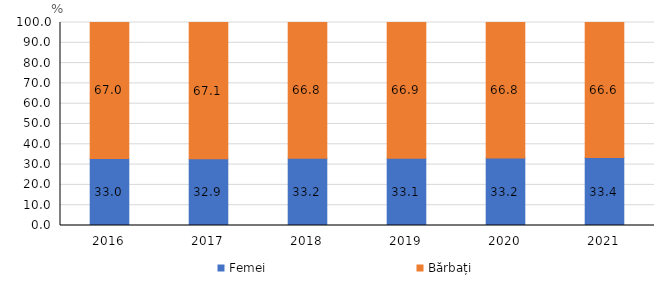
| Category | Femei | Bărbați |
|---|---|---|
| 2016.0 | 33.006 | 66.994 |
| 2017.0 | 32.888 | 67.112 |
| 2018.0 | 33.168 | 66.832 |
| 2019.0 | 33.082 | 66.918 |
| 2020.0 | 33.191 | 66.809 |
| 2021.0 | 33.44 | 66.56 |